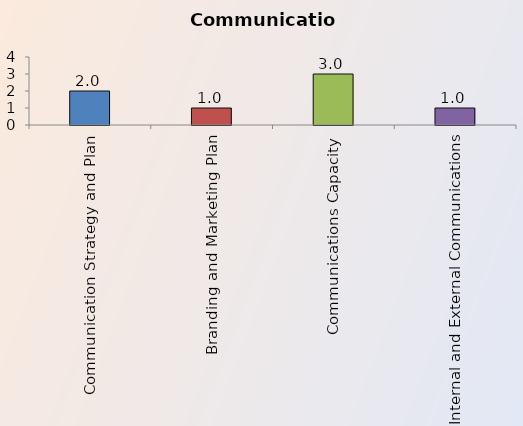
| Category | Series 0 |
|---|---|
| Communication Strategy and Plan | 2 |
| Branding and Marketing Plan | 1 |
| Communications Capacity | 3 |
| Internal and External Communications | 1 |